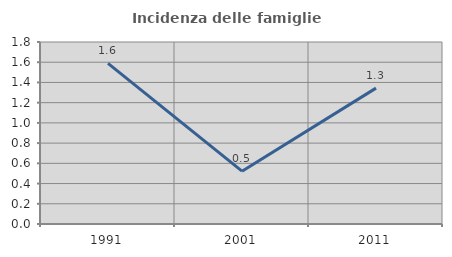
| Category | Incidenza delle famiglie numerose |
|---|---|
| 1991.0 | 1.588 |
| 2001.0 | 0.523 |
| 2011.0 | 1.344 |